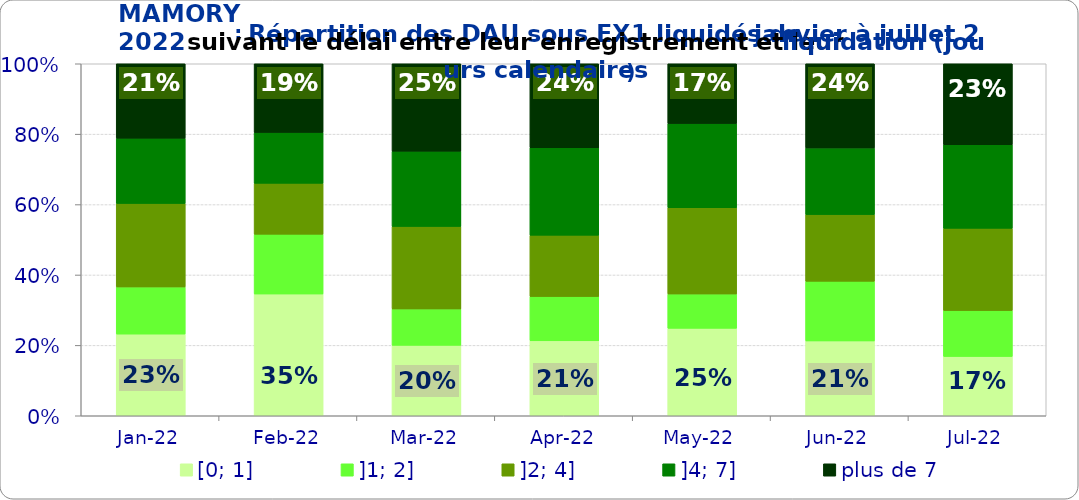
| Category | [0; 1] | ]1; 2] | ]2; 4] | ]4; 7] | plus de 7 |
|---|---|---|---|---|---|
| 2022-01-01 | 0.232 | 0.134 | 0.237 | 0.186 | 0.211 |
| 2022-02-01 | 0.346 | 0.17 | 0.145 | 0.145 | 0.195 |
| 2022-03-01 | 0.2 | 0.103 | 0.234 | 0.214 | 0.248 |
| 2022-04-01 | 0.213 | 0.126 | 0.174 | 0.248 | 0.239 |
| 2022-05-01 | 0.248 | 0.097 | 0.245 | 0.239 | 0.17 |
| 2022-06-01 | 0.213 | 0.169 | 0.189 | 0.189 | 0.239 |
| 2022-07-01 | 0.169 | 0.13 | 0.234 | 0.238 | 0.23 |